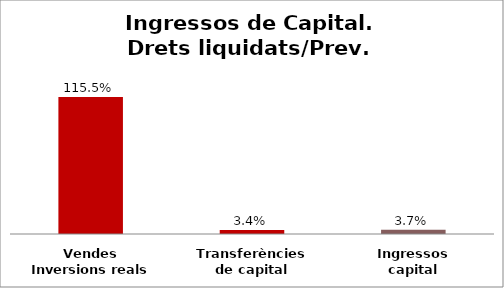
| Category | Series 0 |
|---|---|
| Vendes Inversions reals | 1.155 |
| Transferències de capital | 0.034 |
| Ingressos capital | 0.037 |